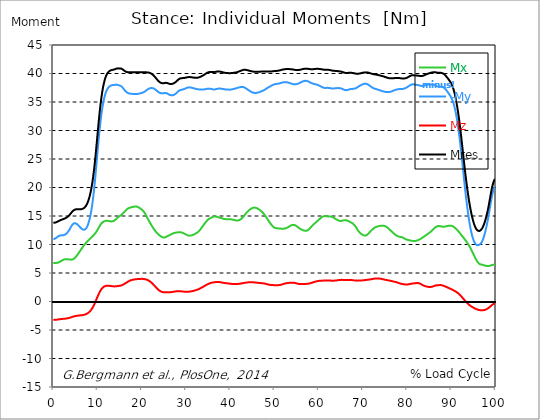
| Category |  Mx |  -My |  Mz |  Mres |
|---|---|---|---|---|
| 0.0 | 6.77 | 10.92 | -3.23 | 13.8 |
| 0.167348456675344 | 6.77 | 10.96 | -3.22 | 13.81 |
| 0.334696913350688 | 6.77 | 11.01 | -3.22 | 13.83 |
| 0.5020453700260321 | 6.77 | 11.09 | -3.21 | 13.87 |
| 0.669393826701376 | 6.77 | 11.18 | -3.2 | 13.91 |
| 0.83674228337672 | 6.78 | 11.29 | -3.18 | 13.97 |
| 1.0040907400520642 | 6.81 | 11.39 | -3.16 | 14.04 |
| 1.1621420602454444 | 6.85 | 11.47 | -3.14 | 14.11 |
| 1.3294905169207885 | 6.91 | 11.53 | -3.12 | 14.17 |
| 1.4968389735961325 | 6.98 | 11.57 | -3.11 | 14.23 |
| 1.6641874302714765 | 7.06 | 11.6 | -3.09 | 14.29 |
| 1.8315358869468206 | 7.14 | 11.61 | -3.07 | 14.34 |
| 1.9988843436221646 | 7.22 | 11.61 | -3.06 | 14.39 |
| 2.1662328002975086 | 7.29 | 11.62 | -3.05 | 14.44 |
| 2.333581256972853 | 7.35 | 11.64 | -3.03 | 14.48 |
| 2.5009297136481967 | 7.39 | 11.68 | -3.02 | 14.53 |
| 2.6682781703235405 | 7.41 | 11.74 | -3.01 | 14.59 |
| 2.8356266269988843 | 7.42 | 11.83 | -2.99 | 14.66 |
| 3.002975083674229 | 7.42 | 11.95 | -2.97 | 14.74 |
| 3.1703235403495724 | 7.41 | 12.09 | -2.95 | 14.83 |
| 3.337671997024917 | 7.4 | 12.26 | -2.93 | 14.94 |
| 3.4957233172182973 | 7.38 | 12.44 | -2.9 | 15.06 |
| 3.663071773893641 | 7.36 | 12.65 | -2.86 | 15.19 |
| 3.8304202305689854 | 7.35 | 12.87 | -2.82 | 15.34 |
| 3.997768687244329 | 7.34 | 13.11 | -2.78 | 15.51 |
| 4.165117143919673 | 7.35 | 13.33 | -2.73 | 15.68 |
| 4.332465600595017 | 7.38 | 13.51 | -2.68 | 15.83 |
| 4.499814057270361 | 7.43 | 13.64 | -2.64 | 15.95 |
| 4.667162513945706 | 7.52 | 13.72 | -2.61 | 16.04 |
| 4.834510970621049 | 7.62 | 13.74 | -2.57 | 16.11 |
| 5.001859427296393 | 7.75 | 13.72 | -2.55 | 16.16 |
| 5.169207883971737 | 7.9 | 13.66 | -2.52 | 16.18 |
| 5.336556340647081 | 8.07 | 13.58 | -2.5 | 16.2 |
| 5.503904797322425 | 8.24 | 13.47 | -2.48 | 16.2 |
| 5.671253253997769 | 8.43 | 13.34 | -2.47 | 16.2 |
| 5.82930457419115 | 8.63 | 13.21 | -2.46 | 16.19 |
| 5.996653030866494 | 8.83 | 13.07 | -2.44 | 16.18 |
| 6.164001487541838 | 9.02 | 12.93 | -2.43 | 16.18 |
| 6.331349944217181 | 9.22 | 12.81 | -2.41 | 16.2 |
| 6.498698400892526 | 9.4 | 12.7 | -2.4 | 16.22 |
| 6.66604685756787 | 9.59 | 12.63 | -2.38 | 16.27 |
| 6.833395314243213 | 9.77 | 12.59 | -2.35 | 16.34 |
| 7.000743770918558 | 9.94 | 12.59 | -2.32 | 16.44 |
| 7.168092227593902 | 10.1 | 12.64 | -2.29 | 16.57 |
| 7.335440684269246 | 10.25 | 12.76 | -2.24 | 16.74 |
| 7.50278914094459 | 10.39 | 12.94 | -2.18 | 16.96 |
| 7.6701375976199335 | 10.52 | 13.18 | -2.11 | 17.22 |
| 7.837486054295278 | 10.66 | 13.5 | -2.02 | 17.54 |
| 7.995537374488658 | 10.79 | 13.89 | -1.92 | 17.91 |
| 8.162885831164003 | 10.92 | 14.37 | -1.8 | 18.36 |
| 8.330234287839346 | 11.05 | 14.93 | -1.67 | 18.87 |
| 8.49758274451469 | 11.17 | 15.59 | -1.51 | 19.48 |
| 8.664931201190035 | 11.3 | 16.36 | -1.33 | 20.17 |
| 8.832279657865378 | 11.43 | 17.24 | -1.13 | 20.97 |
| 8.999628114540721 | 11.56 | 18.24 | -0.9 | 21.88 |
| 9.166976571216066 | 11.7 | 19.36 | -0.65 | 22.9 |
| 9.334325027891412 | 11.84 | 20.61 | -0.37 | 24.04 |
| 9.501673484566755 | 12 | 21.97 | -0.07 | 25.3 |
| 9.669021941242098 | 12.18 | 23.41 | 0.24 | 26.64 |
| 9.836370397917442 | 12.37 | 24.89 | 0.55 | 28.04 |
| 10.003718854592787 | 12.59 | 26.37 | 0.87 | 29.45 |
| 10.17106731126813 | 12.82 | 27.82 | 1.17 | 30.85 |
| 10.329118631461512 | 13.05 | 29.2 | 1.45 | 32.19 |
| 10.496467088136853 | 13.28 | 30.48 | 1.71 | 33.45 |
| 10.663815544812199 | 13.49 | 31.65 | 1.93 | 34.6 |
| 10.831164001487544 | 13.67 | 32.7 | 2.13 | 35.62 |
| 10.998512458162887 | 13.81 | 33.62 | 2.3 | 36.52 |
| 11.16586091483823 | 13.93 | 34.42 | 2.44 | 37.3 |
| 11.333209371513574 | 14.01 | 35.11 | 2.55 | 37.97 |
| 11.50055782818892 | 14.07 | 35.71 | 2.64 | 38.54 |
| 11.667906284864264 | 14.12 | 36.21 | 2.7 | 39.02 |
| 11.835254741539607 | 14.15 | 36.62 | 2.74 | 39.42 |
| 12.00260319821495 | 14.16 | 36.95 | 2.77 | 39.73 |
| 12.169951654890292 | 14.16 | 37.22 | 2.78 | 39.97 |
| 12.337300111565641 | 14.14 | 37.43 | 2.77 | 40.16 |
| 12.504648568240984 | 14.12 | 37.59 | 2.76 | 40.31 |
| 12.662699888434362 | 14.09 | 37.72 | 2.75 | 40.42 |
| 12.830048345109708 | 14.07 | 37.82 | 2.73 | 40.51 |
| 12.997396801785053 | 14.05 | 37.89 | 2.71 | 40.57 |
| 13.164745258460396 | 14.05 | 37.94 | 2.7 | 40.61 |
| 13.33209371513574 | 14.06 | 37.96 | 2.68 | 40.63 |
| 13.499442171811083 | 14.09 | 37.98 | 2.66 | 40.65 |
| 13.666790628486426 | 14.14 | 37.99 | 2.65 | 40.68 |
| 13.834139085161771 | 14.22 | 38.01 | 2.65 | 40.72 |
| 14.001487541837117 | 14.31 | 38.03 | 2.65 | 40.78 |
| 14.16883599851246 | 14.42 | 38.05 | 2.66 | 40.84 |
| 14.336184455187803 | 14.55 | 38.05 | 2.68 | 40.88 |
| 14.503532911863147 | 14.68 | 38.02 | 2.7 | 40.9 |
| 14.670881368538492 | 14.81 | 37.97 | 2.72 | 40.9 |
| 14.828932688731873 | 14.92 | 37.92 | 2.74 | 40.89 |
| 14.996281145407215 | 15.01 | 37.88 | 2.75 | 40.89 |
| 15.163629602082558 | 15.08 | 37.86 | 2.78 | 40.89 |
| 15.330978058757903 | 15.17 | 37.79 | 2.81 | 40.86 |
| 15.498326515433247 | 15.28 | 37.68 | 2.86 | 40.81 |
| 15.665674972108594 | 15.4 | 37.53 | 2.92 | 40.72 |
| 15.833023428783937 | 15.54 | 37.36 | 2.99 | 40.62 |
| 16.00037188545928 | 15.68 | 37.18 | 3.06 | 40.51 |
| 16.167720342134626 | 15.82 | 37.02 | 3.14 | 40.42 |
| 16.335068798809967 | 15.95 | 36.88 | 3.22 | 40.34 |
| 16.502417255485312 | 16.07 | 36.76 | 3.3 | 40.29 |
| 16.669765712160658 | 16.19 | 36.66 | 3.38 | 40.25 |
| 16.837114168836 | 16.3 | 36.58 | 3.46 | 40.22 |
| 17.004462625511344 | 16.38 | 36.53 | 3.53 | 40.21 |
| 17.16251394570472 | 16.43 | 36.49 | 3.6 | 40.2 |
| 17.32986240238007 | 16.48 | 36.46 | 3.66 | 40.2 |
| 17.497210859055414 | 16.51 | 36.44 | 3.72 | 40.2 |
| 17.664559315730756 | 16.53 | 36.43 | 3.77 | 40.21 |
| 17.8319077724061 | 16.56 | 36.43 | 3.8 | 40.21 |
| 17.999256229081443 | 16.6 | 36.42 | 3.83 | 40.22 |
| 18.166604685756788 | 16.63 | 36.4 | 3.85 | 40.23 |
| 18.333953142432133 | 16.66 | 36.39 | 3.87 | 40.23 |
| 18.501301599107478 | 16.67 | 36.39 | 3.89 | 40.23 |
| 18.668650055782823 | 16.67 | 36.39 | 3.9 | 40.23 |
| 18.835998512458165 | 16.65 | 36.4 | 3.92 | 40.24 |
| 19.00334696913351 | 16.61 | 36.41 | 3.93 | 40.24 |
| 19.170695425808855 | 16.56 | 36.44 | 3.94 | 40.24 |
| 19.338043882484197 | 16.49 | 36.46 | 3.95 | 40.24 |
| 19.496095202677576 | 16.41 | 36.49 | 3.96 | 40.24 |
| 19.66344365935292 | 16.32 | 36.52 | 3.97 | 40.23 |
| 19.830792116028263 | 16.22 | 36.55 | 3.97 | 40.22 |
| 19.998140572703612 | 16.11 | 36.59 | 3.97 | 40.21 |
| 20.165489029378953 | 16 | 36.64 | 3.97 | 40.21 |
| 20.3328374860543 | 15.87 | 36.69 | 3.96 | 40.21 |
| 20.500185942729644 | 15.71 | 36.75 | 3.94 | 40.21 |
| 20.667534399404985 | 15.52 | 36.83 | 3.92 | 40.2 |
| 20.83488285608033 | 15.3 | 36.92 | 3.89 | 40.2 |
| 21.002231312755672 | 15.05 | 37.03 | 3.86 | 40.2 |
| 21.16957976943102 | 14.79 | 37.13 | 3.81 | 40.2 |
| 21.336928226106362 | 14.54 | 37.22 | 3.76 | 40.19 |
| 21.504276682781704 | 14.3 | 37.3 | 3.69 | 40.17 |
| 21.67162513945705 | 14.07 | 37.37 | 3.62 | 40.14 |
| 21.82967645965043 | 13.84 | 37.41 | 3.53 | 40.1 |
| 21.997024916325774 | 13.62 | 37.44 | 3.43 | 40.04 |
| 22.16437337300112 | 13.4 | 37.46 | 3.32 | 39.97 |
| 22.33172182967646 | 13.18 | 37.45 | 3.2 | 39.88 |
| 22.499070286351806 | 12.98 | 37.42 | 3.07 | 39.77 |
| 22.666418743027148 | 12.78 | 37.38 | 2.94 | 39.65 |
| 22.833767199702496 | 12.6 | 37.31 | 2.79 | 39.52 |
| 23.00111565637784 | 12.42 | 37.23 | 2.65 | 39.38 |
| 23.168464113053183 | 12.25 | 37.13 | 2.51 | 39.22 |
| 23.335812569728528 | 12.1 | 37.01 | 2.37 | 39.05 |
| 23.50316102640387 | 11.96 | 36.9 | 2.24 | 38.89 |
| 23.670509483079215 | 11.83 | 36.8 | 2.11 | 38.74 |
| 23.83785793975456 | 11.72 | 36.71 | 2 | 38.62 |
| 23.995909259947936 | 11.61 | 36.63 | 1.9 | 38.51 |
| 24.163257716623285 | 11.51 | 36.57 | 1.82 | 38.42 |
| 24.330606173298627 | 11.42 | 36.54 | 1.75 | 38.35 |
| 24.49795462997397 | 11.34 | 36.52 | 1.7 | 38.31 |
| 24.665303086649313 | 11.27 | 36.52 | 1.66 | 38.29 |
| 24.83265154332466 | 11.23 | 36.53 | 1.62 | 38.29 |
| 25.0 | 11.21 | 36.55 | 1.61 | 38.3 |
| 25.167348456675345 | 11.23 | 36.57 | 1.6 | 38.33 |
| 25.334696913350694 | 11.28 | 36.59 | 1.61 | 38.36 |
| 25.502045370026035 | 11.34 | 36.57 | 1.62 | 38.37 |
| 25.669393826701377 | 11.41 | 36.53 | 1.63 | 38.35 |
| 25.836742283376722 | 11.47 | 36.46 | 1.62 | 38.3 |
| 26.004090740052067 | 11.54 | 36.37 | 1.62 | 38.25 |
| 26.17143919672741 | 11.62 | 36.3 | 1.62 | 38.2 |
| 26.329490516920792 | 11.68 | 36.24 | 1.62 | 38.17 |
| 26.49683897359613 | 11.74 | 36.21 | 1.63 | 38.16 |
| 26.66418743027148 | 11.8 | 36.19 | 1.65 | 38.16 |
| 26.831535886946828 | 11.87 | 36.18 | 1.67 | 38.18 |
| 26.998884343622166 | 11.93 | 36.19 | 1.69 | 38.21 |
| 27.166232800297514 | 11.98 | 36.22 | 1.71 | 38.25 |
| 27.333581256972852 | 12.02 | 36.27 | 1.74 | 38.32 |
| 27.5009297136482 | 12.06 | 36.35 | 1.76 | 38.4 |
| 27.668278170323543 | 12.08 | 36.46 | 1.78 | 38.52 |
| 27.835626626998888 | 12.1 | 36.58 | 1.79 | 38.63 |
| 28.002975083674233 | 12.12 | 36.7 | 1.8 | 38.75 |
| 28.170323540349575 | 12.13 | 36.82 | 1.81 | 38.87 |
| 28.33767199702492 | 12.14 | 36.94 | 1.81 | 38.99 |
| 28.50502045370026 | 12.14 | 37.03 | 1.81 | 39.08 |
| 28.663071773893645 | 12.14 | 37.09 | 1.8 | 39.13 |
| 28.830420230568986 | 12.14 | 37.13 | 1.79 | 39.17 |
| 28.99776868724433 | 12.12 | 37.16 | 1.77 | 39.18 |
| 29.165117143919673 | 12.08 | 37.18 | 1.76 | 39.19 |
| 29.33246560059502 | 12.02 | 37.21 | 1.74 | 39.2 |
| 29.499814057270367 | 11.96 | 37.25 | 1.73 | 39.21 |
| 29.66716251394571 | 11.89 | 37.3 | 1.72 | 39.23 |
| 29.834510970621054 | 11.81 | 37.36 | 1.71 | 39.26 |
| 30.00185942729639 | 11.74 | 37.42 | 1.7 | 39.29 |
| 30.169207883971744 | 11.67 | 37.48 | 1.71 | 39.33 |
| 30.33655634064708 | 11.61 | 37.53 | 1.71 | 39.35 |
| 30.50390479732243 | 11.57 | 37.56 | 1.72 | 39.37 |
| 30.671253253997772 | 11.55 | 37.57 | 1.73 | 39.38 |
| 30.829304574191156 | 11.56 | 37.56 | 1.74 | 39.37 |
| 30.996653030866494 | 11.57 | 37.55 | 1.76 | 39.36 |
| 31.164001487541842 | 11.59 | 37.52 | 1.78 | 39.34 |
| 31.331349944217187 | 11.62 | 37.49 | 1.81 | 39.32 |
| 31.498698400892525 | 11.67 | 37.46 | 1.83 | 39.31 |
| 31.666046857567874 | 11.72 | 37.42 | 1.87 | 39.29 |
| 31.833395314243212 | 11.77 | 37.38 | 1.9 | 39.27 |
| 32.00074377091856 | 11.84 | 37.35 | 1.94 | 39.26 |
| 32.1680922275939 | 11.91 | 37.31 | 1.98 | 39.25 |
| 32.33544068426925 | 11.99 | 37.28 | 2.02 | 39.25 |
| 32.50278914094459 | 12.07 | 37.25 | 2.07 | 39.26 |
| 32.670137597619934 | 12.16 | 37.23 | 2.11 | 39.27 |
| 32.83748605429528 | 12.28 | 37.22 | 2.16 | 39.3 |
| 33.004834510970625 | 12.41 | 37.21 | 2.22 | 39.34 |
| 33.162885831164004 | 12.57 | 37.2 | 2.28 | 39.4 |
| 33.33023428783935 | 12.74 | 37.2 | 2.35 | 39.46 |
| 33.497582744514695 | 12.92 | 37.19 | 2.43 | 39.52 |
| 33.664931201190036 | 13.1 | 37.19 | 2.5 | 39.58 |
| 33.83227965786538 | 13.28 | 37.19 | 2.57 | 39.65 |
| 33.99962811454073 | 13.46 | 37.2 | 2.65 | 39.73 |
| 34.16697657121607 | 13.64 | 37.21 | 2.72 | 39.81 |
| 34.33432502789141 | 13.81 | 37.24 | 2.8 | 39.9 |
| 34.50167348456676 | 13.98 | 37.28 | 2.87 | 40 |
| 34.6690219412421 | 14.13 | 37.31 | 2.95 | 40.08 |
| 34.83637039791744 | 14.26 | 37.33 | 3.01 | 40.15 |
| 35.00371885459279 | 14.37 | 37.34 | 3.08 | 40.2 |
| 35.17106731126814 | 14.47 | 37.35 | 3.13 | 40.24 |
| 35.338415767943474 | 14.55 | 37.34 | 3.18 | 40.26 |
| 35.49646708813686 | 14.62 | 37.33 | 3.23 | 40.27 |
| 35.6638155448122 | 14.69 | 37.3 | 3.27 | 40.28 |
| 35.831164001487544 | 14.77 | 37.26 | 3.3 | 40.27 |
| 35.998512458162885 | 14.84 | 37.22 | 3.32 | 40.26 |
| 36.165860914838234 | 14.89 | 37.2 | 3.35 | 40.26 |
| 36.333209371513576 | 14.92 | 37.19 | 3.37 | 40.26 |
| 36.50055782818892 | 14.92 | 37.2 | 3.39 | 40.27 |
| 36.667906284864266 | 14.91 | 37.23 | 3.4 | 40.29 |
| 36.83525474153961 | 14.88 | 37.26 | 3.41 | 40.31 |
| 37.002603198214956 | 14.85 | 37.3 | 3.42 | 40.34 |
| 37.1699516548903 | 14.81 | 37.33 | 3.42 | 40.35 |
| 37.337300111565646 | 14.77 | 37.35 | 3.42 | 40.36 |
| 37.50464856824098 | 14.73 | 37.36 | 3.41 | 40.35 |
| 37.66269988843437 | 14.7 | 37.36 | 3.39 | 40.34 |
| 37.83004834510971 | 14.66 | 37.34 | 3.37 | 40.31 |
| 37.99739680178505 | 14.61 | 37.33 | 3.35 | 40.28 |
| 38.16474525846039 | 14.58 | 37.3 | 3.32 | 40.24 |
| 38.33209371513574 | 14.54 | 37.28 | 3.3 | 40.21 |
| 38.49944217181109 | 14.5 | 37.26 | 3.27 | 40.17 |
| 38.666790628486424 | 14.48 | 37.24 | 3.25 | 40.14 |
| 38.83413908516178 | 14.46 | 37.22 | 3.23 | 40.12 |
| 39.001487541837115 | 14.45 | 37.2 | 3.21 | 40.1 |
| 39.16883599851246 | 14.44 | 37.19 | 3.2 | 40.09 |
| 39.336184455187805 | 14.44 | 37.18 | 3.19 | 40.08 |
| 39.503532911863154 | 14.44 | 37.17 | 3.17 | 40.07 |
| 39.670881368538495 | 14.44 | 37.17 | 3.15 | 40.06 |
| 39.83822982521384 | 14.44 | 37.17 | 3.14 | 40.06 |
| 39.996281145407224 | 14.43 | 37.17 | 3.12 | 40.06 |
| 40.163629602082565 | 14.42 | 37.19 | 3.1 | 40.07 |
| 40.33097805875791 | 14.4 | 37.21 | 3.09 | 40.08 |
| 40.498326515433256 | 14.37 | 37.24 | 3.08 | 40.1 |
| 40.6656749721086 | 14.34 | 37.27 | 3.07 | 40.11 |
| 40.83302342878393 | 14.3 | 37.3 | 3.07 | 40.13 |
| 41.00037188545929 | 14.27 | 37.33 | 3.06 | 40.15 |
| 41.16772034213463 | 14.24 | 37.36 | 3.06 | 40.17 |
| 41.33506879880997 | 14.22 | 37.4 | 3.07 | 40.19 |
| 41.50241725548531 | 14.21 | 37.44 | 3.07 | 40.23 |
| 41.66976571216066 | 14.21 | 37.49 | 3.08 | 40.27 |
| 41.837114168836 | 14.23 | 37.53 | 3.09 | 40.31 |
| 42.004462625511344 | 14.27 | 37.56 | 3.1 | 40.36 |
| 42.17181108218669 | 14.33 | 37.6 | 3.12 | 40.41 |
| 42.32986240238007 | 14.41 | 37.62 | 3.14 | 40.47 |
| 42.497210859055414 | 14.51 | 37.64 | 3.16 | 40.52 |
| 42.66455931573076 | 14.63 | 37.65 | 3.18 | 40.57 |
| 42.831907772406105 | 14.77 | 37.64 | 3.21 | 40.61 |
| 42.999256229081446 | 14.92 | 37.61 | 3.23 | 40.64 |
| 43.16660468575679 | 15.09 | 37.56 | 3.26 | 40.66 |
| 43.33395314243214 | 15.26 | 37.49 | 3.28 | 40.66 |
| 43.50130159910748 | 15.42 | 37.41 | 3.31 | 40.65 |
| 43.66865005578282 | 15.57 | 37.33 | 3.33 | 40.62 |
| 43.83599851245817 | 15.71 | 37.23 | 3.34 | 40.59 |
| 44.00334696913351 | 15.84 | 37.14 | 3.35 | 40.56 |
| 44.17069542580886 | 15.96 | 37.05 | 3.37 | 40.52 |
| 44.3380438824842 | 16.07 | 36.97 | 3.37 | 40.48 |
| 44.49609520267758 | 16.17 | 36.88 | 3.38 | 40.44 |
| 44.66344365935292 | 16.26 | 36.81 | 3.38 | 40.41 |
| 44.83079211602827 | 16.34 | 36.74 | 3.38 | 40.38 |
| 44.99814057270361 | 16.41 | 36.68 | 3.38 | 40.36 |
| 45.16548902937895 | 16.46 | 36.64 | 3.37 | 40.34 |
| 45.332837486054295 | 16.48 | 36.61 | 3.36 | 40.32 |
| 45.500185942729644 | 16.48 | 36.6 | 3.35 | 40.31 |
| 45.66753439940499 | 16.46 | 36.59 | 3.34 | 40.3 |
| 45.83488285608033 | 16.42 | 36.6 | 3.32 | 40.29 |
| 46.00223131275568 | 16.37 | 36.61 | 3.31 | 40.29 |
| 46.16957976943102 | 16.31 | 36.64 | 3.29 | 40.29 |
| 46.336928226106366 | 16.23 | 36.67 | 3.28 | 40.29 |
| 46.50427668278171 | 16.15 | 36.71 | 3.26 | 40.3 |
| 46.671625139457056 | 16.05 | 36.76 | 3.25 | 40.31 |
| 46.829676459650436 | 15.95 | 36.81 | 3.23 | 40.33 |
| 46.99702491632577 | 15.85 | 36.86 | 3.22 | 40.34 |
| 47.16437337300112 | 15.74 | 36.91 | 3.21 | 40.34 |
| 47.33172182967646 | 15.61 | 36.96 | 3.19 | 40.35 |
| 47.49907028635181 | 15.47 | 37.03 | 3.18 | 40.36 |
| 47.66641874302716 | 15.31 | 37.1 | 3.16 | 40.36 |
| 47.83376719970249 | 15.13 | 37.17 | 3.14 | 40.36 |
| 48.001115656377834 | 14.93 | 37.26 | 3.1 | 40.36 |
| 48.16846411305319 | 14.73 | 37.35 | 3.06 | 40.37 |
| 48.33581256972853 | 14.53 | 37.44 | 3.03 | 40.37 |
| 48.50316102640387 | 14.34 | 37.52 | 3 | 40.37 |
| 48.67050948307921 | 14.14 | 37.59 | 2.97 | 40.36 |
| 48.837857939754564 | 13.96 | 37.66 | 2.94 | 40.36 |
| 49.005206396429905 | 13.78 | 37.73 | 2.92 | 40.36 |
| 49.163257716623285 | 13.6 | 37.8 | 2.9 | 40.36 |
| 49.33060617329863 | 13.43 | 37.87 | 2.89 | 40.37 |
| 49.49795462997397 | 13.28 | 37.94 | 2.88 | 40.38 |
| 49.66530308664932 | 13.15 | 38 | 2.88 | 40.39 |
| 49.832651543324666 | 13.03 | 38.06 | 2.87 | 40.41 |
| 50.0 | 12.95 | 38.11 | 2.86 | 40.43 |
| 50.16734845667534 | 12.89 | 38.15 | 2.86 | 40.44 |
| 50.33469691335069 | 12.86 | 38.17 | 2.85 | 40.45 |
| 50.50204537002604 | 12.84 | 38.18 | 2.85 | 40.46 |
| 50.66939382670139 | 12.84 | 38.19 | 2.85 | 40.47 |
| 50.836742283376715 | 12.83 | 38.21 | 2.86 | 40.48 |
| 51.00409074005207 | 12.83 | 38.23 | 2.87 | 40.51 |
| 51.17143919672741 | 12.81 | 38.27 | 2.89 | 40.54 |
| 51.32949051692079 | 12.8 | 38.32 | 2.92 | 40.58 |
| 51.496838973596134 | 12.78 | 38.36 | 2.95 | 40.62 |
| 51.66418743027148 | 12.76 | 38.4 | 2.99 | 40.66 |
| 51.831535886946824 | 12.75 | 38.44 | 3.03 | 40.69 |
| 51.99888434362217 | 12.75 | 38.46 | 3.07 | 40.71 |
| 52.16623280029752 | 12.77 | 38.47 | 3.11 | 40.73 |
| 52.33358125697285 | 12.8 | 38.48 | 3.14 | 40.75 |
| 52.5009297136482 | 12.84 | 38.48 | 3.18 | 40.76 |
| 52.668278170323546 | 12.88 | 38.48 | 3.2 | 40.78 |
| 52.835626626998895 | 12.94 | 38.46 | 3.22 | 40.79 |
| 53.00297508367424 | 13.01 | 38.43 | 3.24 | 40.79 |
| 53.17032354034958 | 13.08 | 38.39 | 3.26 | 40.78 |
| 53.33767199702492 | 13.16 | 38.35 | 3.27 | 40.77 |
| 53.50502045370027 | 13.24 | 38.3 | 3.29 | 40.76 |
| 53.663071773893655 | 13.32 | 38.26 | 3.3 | 40.75 |
| 53.83042023056899 | 13.39 | 38.22 | 3.31 | 40.74 |
| 53.99776868724433 | 13.43 | 38.18 | 3.31 | 40.73 |
| 54.16511714391967 | 13.45 | 38.16 | 3.3 | 40.71 |
| 54.33246560059503 | 13.45 | 38.13 | 3.29 | 40.68 |
| 54.49981405727037 | 13.42 | 38.12 | 3.27 | 40.66 |
| 54.667162513945705 | 13.37 | 38.11 | 3.25 | 40.63 |
| 54.834510970621054 | 13.3 | 38.12 | 3.22 | 40.61 |
| 55.0018594272964 | 13.21 | 38.14 | 3.18 | 40.59 |
| 55.169207883971744 | 13.11 | 38.17 | 3.14 | 40.59 |
| 55.336556340647086 | 13.01 | 38.22 | 3.11 | 40.6 |
| 55.50390479732243 | 12.92 | 38.27 | 3.08 | 40.61 |
| 55.671253253997776 | 12.83 | 38.33 | 3.06 | 40.64 |
| 55.83860171067312 | 12.75 | 38.39 | 3.05 | 40.67 |
| 55.9966530308665 | 12.68 | 38.46 | 3.05 | 40.7 |
| 56.16400148754184 | 12.6 | 38.53 | 3.05 | 40.74 |
| 56.33134994421718 | 12.54 | 38.59 | 3.06 | 40.77 |
| 56.498698400892536 | 12.49 | 38.64 | 3.06 | 40.81 |
| 56.66604685756788 | 12.44 | 38.68 | 3.07 | 40.83 |
| 56.83339531424321 | 12.41 | 38.71 | 3.08 | 40.84 |
| 57.00074377091856 | 12.4 | 38.72 | 3.08 | 40.85 |
| 57.16809222759391 | 12.4 | 38.71 | 3.09 | 40.85 |
| 57.33544068426925 | 12.43 | 38.69 | 3.1 | 40.85 |
| 57.5027891409446 | 12.5 | 38.66 | 3.11 | 40.83 |
| 57.670137597619934 | 12.59 | 38.6 | 3.13 | 40.81 |
| 57.83748605429528 | 12.7 | 38.53 | 3.15 | 40.79 |
| 58.004834510970625 | 12.84 | 38.46 | 3.18 | 40.77 |
| 58.16288583116401 | 12.98 | 38.39 | 3.22 | 40.76 |
| 58.330234287839346 | 13.12 | 38.33 | 3.26 | 40.75 |
| 58.497582744514695 | 13.27 | 38.27 | 3.3 | 40.75 |
| 58.66493120119004 | 13.4 | 38.22 | 3.35 | 40.75 |
| 58.832279657865385 | 13.53 | 38.18 | 3.39 | 40.76 |
| 58.999628114540734 | 13.64 | 38.16 | 3.44 | 40.78 |
| 59.16697657121607 | 13.75 | 38.13 | 3.47 | 40.8 |
| 59.33432502789142 | 13.87 | 38.1 | 3.51 | 40.81 |
| 59.50167348456676 | 13.98 | 38.07 | 3.54 | 40.82 |
| 59.66902194124211 | 14.1 | 38.02 | 3.57 | 40.82 |
| 59.83637039791745 | 14.21 | 37.97 | 3.59 | 40.82 |
| 60.00371885459278 | 14.33 | 37.91 | 3.61 | 40.81 |
| 60.17106731126813 | 14.45 | 37.85 | 3.63 | 40.8 |
| 60.33841576794349 | 14.57 | 37.78 | 3.64 | 40.78 |
| 60.49646708813685 | 14.68 | 37.71 | 3.65 | 40.76 |
| 60.6638155448122 | 14.78 | 37.65 | 3.66 | 40.74 |
| 60.831164001487544 | 14.86 | 37.58 | 3.66 | 40.71 |
| 60.99851245816289 | 14.93 | 37.53 | 3.67 | 40.69 |
| 61.16586091483824 | 14.97 | 37.49 | 3.67 | 40.67 |
| 61.333209371513576 | 15 | 37.47 | 3.68 | 40.66 |
| 61.50055782818892 | 14.99 | 37.46 | 3.68 | 40.66 |
| 61.667906284864266 | 14.97 | 37.47 | 3.69 | 40.66 |
| 61.835254741539615 | 14.95 | 37.48 | 3.7 | 40.66 |
| 62.002603198214956 | 14.93 | 37.49 | 3.7 | 40.66 |
| 62.16995165489029 | 14.92 | 37.48 | 3.69 | 40.65 |
| 62.33730011156564 | 14.92 | 37.46 | 3.69 | 40.63 |
| 62.504648568240995 | 14.91 | 37.44 | 3.68 | 40.61 |
| 62.67199702491633 | 14.9 | 37.42 | 3.67 | 40.58 |
| 62.83004834510971 | 14.88 | 37.4 | 3.66 | 40.55 |
| 62.99739680178505 | 14.84 | 37.38 | 3.65 | 40.52 |
| 63.1647452584604 | 14.79 | 37.37 | 3.65 | 40.49 |
| 63.33209371513575 | 14.72 | 37.37 | 3.65 | 40.47 |
| 63.4994421718111 | 14.64 | 37.38 | 3.66 | 40.46 |
| 63.666790628486424 | 14.56 | 37.4 | 3.67 | 40.46 |
| 63.83413908516177 | 14.47 | 37.42 | 3.68 | 40.45 |
| 64.00148754183712 | 14.4 | 37.43 | 3.69 | 40.44 |
| 64.16883599851248 | 14.32 | 37.43 | 3.71 | 40.42 |
| 64.3361844551878 | 14.26 | 37.44 | 3.73 | 40.41 |
| 64.50353291186315 | 14.2 | 37.43 | 3.75 | 40.39 |
| 64.6708813685385 | 14.16 | 37.43 | 3.77 | 40.38 |
| 64.83822982521384 | 14.13 | 37.42 | 3.78 | 40.36 |
| 65.00557828188919 | 14.13 | 37.39 | 3.79 | 40.34 |
| 65.16362960208257 | 14.15 | 37.35 | 3.8 | 40.31 |
| 65.3309780587579 | 14.18 | 37.3 | 3.8 | 40.27 |
| 65.49832651543326 | 14.22 | 37.24 | 3.79 | 40.23 |
| 65.6656749721086 | 14.25 | 37.18 | 3.78 | 40.18 |
| 65.83302342878395 | 14.26 | 37.13 | 3.78 | 40.14 |
| 66.00037188545929 | 14.27 | 37.09 | 3.77 | 40.11 |
| 66.16772034213463 | 14.26 | 37.07 | 3.77 | 40.09 |
| 66.33506879880998 | 14.23 | 37.08 | 3.78 | 40.08 |
| 66.50241725548531 | 14.18 | 37.11 | 3.78 | 40.09 |
| 66.66976571216065 | 14.12 | 37.15 | 3.79 | 40.11 |
| 66.83711416883601 | 14.06 | 37.19 | 3.79 | 40.12 |
| 67.00446262551135 | 13.99 | 37.23 | 3.79 | 40.13 |
| 67.1718110821867 | 13.93 | 37.26 | 3.78 | 40.13 |
| 67.32986240238007 | 13.86 | 37.28 | 3.77 | 40.13 |
| 67.49721085905541 | 13.78 | 37.29 | 3.76 | 40.11 |
| 67.66455931573076 | 13.69 | 37.3 | 3.74 | 40.09 |
| 67.83190777240611 | 13.59 | 37.32 | 3.72 | 40.07 |
| 67.99925622908145 | 13.47 | 37.33 | 3.71 | 40.04 |
| 68.16660468575678 | 13.33 | 37.36 | 3.69 | 40.01 |
| 68.33395314243214 | 13.16 | 37.4 | 3.68 | 39.98 |
| 68.50130159910749 | 12.95 | 37.46 | 3.67 | 39.96 |
| 68.66865005578282 | 12.73 | 37.54 | 3.66 | 39.95 |
| 68.83599851245816 | 12.51 | 37.63 | 3.66 | 39.95 |
| 69.00334696913352 | 12.33 | 37.71 | 3.66 | 39.97 |
| 69.17069542580886 | 12.17 | 37.79 | 3.67 | 39.99 |
| 69.3380438824842 | 12.04 | 37.87 | 3.67 | 40.01 |
| 69.50539233915956 | 11.92 | 37.94 | 3.68 | 40.04 |
| 69.66344365935292 | 11.82 | 38.01 | 3.69 | 40.08 |
| 69.83079211602826 | 11.73 | 38.07 | 3.7 | 40.11 |
| 69.99814057270362 | 11.66 | 38.13 | 3.72 | 40.14 |
| 70.16548902937896 | 11.6 | 38.17 | 3.73 | 40.17 |
| 70.33283748605429 | 11.56 | 38.2 | 3.75 | 40.18 |
| 70.50018594272964 | 11.55 | 38.21 | 3.76 | 40.19 |
| 70.667534399405 | 11.58 | 38.2 | 3.78 | 40.2 |
| 70.83488285608033 | 11.64 | 38.18 | 3.79 | 40.19 |
| 71.00223131275568 | 11.73 | 38.13 | 3.81 | 40.18 |
| 71.16957976943102 | 11.84 | 38.06 | 3.82 | 40.15 |
| 71.33692822610637 | 11.99 | 37.97 | 3.84 | 40.12 |
| 71.50427668278171 | 12.14 | 37.87 | 3.86 | 40.08 |
| 71.67162513945706 | 12.29 | 37.77 | 3.88 | 40.04 |
| 71.8389735961324 | 12.43 | 37.68 | 3.9 | 40 |
| 71.99702491632577 | 12.55 | 37.59 | 3.92 | 39.96 |
| 72.16437337300113 | 12.68 | 37.51 | 3.95 | 39.92 |
| 72.33172182967647 | 12.78 | 37.44 | 3.97 | 39.89 |
| 72.49907028635181 | 12.88 | 37.38 | 4 | 39.86 |
| 72.66641874302715 | 12.96 | 37.33 | 4.02 | 39.84 |
| 72.8337671997025 | 13.02 | 37.29 | 4.04 | 39.83 |
| 73.00111565637783 | 13.08 | 37.26 | 4.05 | 39.81 |
| 73.16846411305319 | 13.13 | 37.22 | 4.05 | 39.78 |
| 73.33581256972853 | 13.17 | 37.18 | 4.05 | 39.76 |
| 73.50316102640387 | 13.2 | 37.13 | 4.04 | 39.73 |
| 73.67050948307921 | 13.23 | 37.09 | 4.03 | 39.69 |
| 73.83785793975457 | 13.26 | 37.04 | 4.01 | 39.66 |
| 74.00520639642991 | 13.28 | 37 | 3.99 | 39.62 |
| 74.16325771662328 | 13.3 | 36.96 | 3.97 | 39.58 |
| 74.33060617329863 | 13.31 | 36.92 | 3.94 | 39.55 |
| 74.49795462997398 | 13.31 | 36.89 | 3.91 | 39.52 |
| 74.66530308664932 | 13.3 | 36.85 | 3.88 | 39.48 |
| 74.83265154332466 | 13.27 | 36.82 | 3.85 | 39.44 |
| 75.00000000000001 | 13.22 | 36.79 | 3.82 | 39.39 |
| 75.16734845667534 | 13.16 | 36.77 | 3.79 | 39.35 |
| 75.3346969133507 | 13.08 | 36.75 | 3.76 | 39.3 |
| 75.50204537002605 | 12.99 | 36.74 | 3.74 | 39.26 |
| 75.66939382670138 | 12.88 | 36.73 | 3.71 | 39.22 |
| 75.83674228337672 | 12.76 | 36.74 | 3.69 | 39.19 |
| 76.00409074005208 | 12.65 | 36.76 | 3.67 | 39.17 |
| 76.17143919672742 | 12.53 | 36.79 | 3.64 | 39.15 |
| 76.33878765340276 | 12.4 | 36.82 | 3.61 | 39.15 |
| 76.49683897359614 | 12.28 | 36.86 | 3.58 | 39.14 |
| 76.66418743027148 | 12.16 | 36.92 | 3.55 | 39.15 |
| 76.83153588694682 | 12.04 | 36.97 | 3.52 | 39.16 |
| 76.99888434362218 | 11.92 | 37.03 | 3.49 | 39.18 |
| 77.16623280029752 | 11.81 | 37.09 | 3.46 | 39.19 |
| 77.33358125697285 | 11.71 | 37.13 | 3.43 | 39.2 |
| 77.5009297136482 | 11.61 | 37.17 | 3.4 | 39.21 |
| 77.66827817032356 | 11.53 | 37.2 | 3.37 | 39.21 |
| 77.83562662699889 | 11.47 | 37.23 | 3.32 | 39.21 |
| 78.00297508367423 | 11.41 | 37.25 | 3.28 | 39.21 |
| 78.17032354034959 | 11.37 | 37.26 | 3.23 | 39.2 |
| 78.33767199702493 | 11.34 | 37.27 | 3.18 | 39.19 |
| 78.50502045370027 | 11.33 | 37.27 | 3.14 | 39.17 |
| 78.67236891037561 | 11.31 | 37.26 | 3.1 | 39.15 |
| 78.83042023056899 | 11.27 | 37.26 | 3.07 | 39.13 |
| 78.99776868724433 | 11.22 | 37.28 | 3.05 | 39.12 |
| 79.16511714391969 | 11.15 | 37.31 | 3.03 | 39.12 |
| 79.33246560059503 | 11.08 | 37.35 | 3.01 | 39.13 |
| 79.49981405727036 | 11 | 37.4 | 3 | 39.14 |
| 79.66716251394571 | 10.93 | 37.46 | 2.99 | 39.17 |
| 79.83451097062107 | 10.88 | 37.52 | 2.99 | 39.21 |
| 80.00185942729641 | 10.84 | 37.6 | 2.99 | 39.27 |
| 80.16920788397174 | 10.8 | 37.68 | 3 | 39.34 |
| 80.33655634064709 | 10.77 | 37.77 | 3.02 | 39.42 |
| 80.50390479732243 | 10.74 | 37.86 | 3.05 | 39.5 |
| 80.67125325399778 | 10.71 | 37.95 | 3.07 | 39.57 |
| 80.83860171067312 | 10.69 | 38.03 | 3.1 | 39.64 |
| 80.99665303086651 | 10.66 | 38.08 | 3.13 | 39.68 |
| 81.16400148754184 | 10.64 | 38.11 | 3.15 | 39.71 |
| 81.3313499442172 | 10.62 | 38.11 | 3.17 | 39.71 |
| 81.49869840089255 | 10.61 | 38.09 | 3.18 | 39.68 |
| 81.66604685756786 | 10.61 | 38.06 | 3.2 | 39.66 |
| 81.83339531424322 | 10.63 | 38.04 | 3.21 | 39.64 |
| 82.00074377091858 | 10.65 | 38.02 | 3.22 | 39.63 |
| 82.16809222759392 | 10.69 | 38.01 | 3.23 | 39.63 |
| 82.33544068426926 | 10.73 | 37.99 | 3.24 | 39.63 |
| 82.50278914094459 | 10.78 | 37.97 | 3.23 | 39.62 |
| 82.67013759761994 | 10.84 | 37.93 | 3.2 | 39.6 |
| 82.83748605429528 | 10.9 | 37.89 | 3.16 | 39.57 |
| 83.00483451097062 | 10.97 | 37.85 | 3.1 | 39.55 |
| 83.17218296764597 | 11.05 | 37.82 | 3.03 | 39.54 |
| 83.33023428783935 | 11.14 | 37.81 | 2.95 | 39.54 |
| 83.4975827445147 | 11.23 | 37.82 | 2.87 | 39.58 |
| 83.66493120119004 | 11.32 | 37.85 | 2.8 | 39.63 |
| 83.83227965786537 | 11.41 | 37.89 | 2.75 | 39.69 |
| 83.99962811454073 | 11.49 | 37.92 | 2.7 | 39.74 |
| 84.16697657121607 | 11.58 | 37.95 | 2.67 | 39.8 |
| 84.33432502789142 | 11.68 | 37.99 | 2.64 | 39.85 |
| 84.50167348456677 | 11.77 | 38.01 | 2.61 | 39.91 |
| 84.6690219412421 | 11.87 | 38.04 | 2.58 | 39.96 |
| 84.83637039791745 | 11.96 | 38.06 | 2.56 | 40.01 |
| 85.0037188545928 | 12.05 | 38.07 | 2.55 | 40.05 |
| 85.17106731126813 | 12.14 | 38.09 | 2.55 | 40.09 |
| 85.33841576794349 | 12.24 | 38.09 | 2.55 | 40.13 |
| 85.50576422461883 | 12.35 | 38.09 | 2.57 | 40.16 |
| 85.66381554481221 | 12.48 | 38.08 | 2.6 | 40.19 |
| 85.83116400148755 | 12.61 | 38.06 | 2.64 | 40.22 |
| 85.99851245816289 | 12.76 | 38.01 | 2.7 | 40.23 |
| 86.16586091483823 | 12.89 | 37.95 | 2.76 | 40.23 |
| 86.33320937151358 | 13 | 37.89 | 2.8 | 40.22 |
| 86.50055782818893 | 13.09 | 37.83 | 2.82 | 40.2 |
| 86.66790628486427 | 13.16 | 37.78 | 2.84 | 40.17 |
| 86.83525474153961 | 13.21 | 37.73 | 2.85 | 40.15 |
| 87.00260319821496 | 13.24 | 37.7 | 2.86 | 40.13 |
| 87.16995165489031 | 13.24 | 37.69 | 2.87 | 40.12 |
| 87.33730011156564 | 13.22 | 37.68 | 2.88 | 40.12 |
| 87.504648568241 | 13.2 | 37.69 | 2.88 | 40.11 |
| 87.67199702491634 | 13.18 | 37.69 | 2.87 | 40.11 |
| 87.83004834510972 | 13.15 | 37.69 | 2.86 | 40.09 |
| 87.99739680178506 | 13.13 | 37.66 | 2.83 | 40.05 |
| 88.1647452584604 | 13.12 | 37.61 | 2.78 | 39.99 |
| 88.33209371513574 | 13.12 | 37.52 | 2.73 | 39.9 |
| 88.49944217181108 | 13.14 | 37.4 | 2.67 | 39.79 |
| 88.66679062848644 | 13.17 | 37.26 | 2.61 | 39.65 |
| 88.83413908516178 | 13.2 | 37.1 | 2.56 | 39.5 |
| 89.00148754183712 | 13.23 | 36.93 | 2.5 | 39.34 |
| 89.16883599851246 | 13.25 | 36.75 | 2.44 | 39.18 |
| 89.33618445518782 | 13.28 | 36.56 | 2.38 | 39 |
| 89.50353291186315 | 13.3 | 36.37 | 2.33 | 38.83 |
| 89.6708813685385 | 13.31 | 36.18 | 2.27 | 38.64 |
| 89.83822982521386 | 13.31 | 35.97 | 2.21 | 38.44 |
| 90.00557828188919 | 13.29 | 35.72 | 2.16 | 38.2 |
| 90.16362960208257 | 13.25 | 35.44 | 2.09 | 37.92 |
| 90.3309780587579 | 13.19 | 35.1 | 2.02 | 37.58 |
| 90.49832651543326 | 13.12 | 34.71 | 1.95 | 37.18 |
| 90.66567497210859 | 13.02 | 34.24 | 1.88 | 36.71 |
| 90.83302342878395 | 12.9 | 33.69 | 1.81 | 36.16 |
| 91.00037188545929 | 12.79 | 33.06 | 1.73 | 35.54 |
| 91.16772034213463 | 12.66 | 32.36 | 1.65 | 34.85 |
| 91.33506879880998 | 12.53 | 31.58 | 1.56 | 34.08 |
| 91.50241725548533 | 12.39 | 30.73 | 1.46 | 33.25 |
| 91.66976571216065 | 12.23 | 29.8 | 1.35 | 32.34 |
| 91.83711416883601 | 12.07 | 28.8 | 1.23 | 31.37 |
| 92.00446262551137 | 11.91 | 27.73 | 1.11 | 30.33 |
| 92.1718110821867 | 11.74 | 26.59 | 0.97 | 29.23 |
| 92.33915953886203 | 11.57 | 25.4 | 0.83 | 28.1 |
| 92.49721085905541 | 11.4 | 24.17 | 0.67 | 26.93 |
| 92.66455931573077 | 11.24 | 22.92 | 0.52 | 25.75 |
| 92.83190777240611 | 11.08 | 21.66 | 0.36 | 24.58 |
| 92.99925622908145 | 10.92 | 20.43 | 0.21 | 23.43 |
| 93.1666046857568 | 10.76 | 19.24 | 0.06 | 22.33 |
| 93.33395314243214 | 10.59 | 18.11 | -0.08 | 21.28 |
| 93.50130159910749 | 10.41 | 17.05 | -0.21 | 20.29 |
| 93.66865005578283 | 10.21 | 16.05 | -0.34 | 19.34 |
| 93.83599851245818 | 10.01 | 15.12 | -0.46 | 18.45 |
| 94.00334696913353 | 9.79 | 14.25 | -0.57 | 17.61 |
| 94.17069542580886 | 9.57 | 13.47 | -0.68 | 16.84 |
| 94.3380438824842 | 9.33 | 12.76 | -0.78 | 16.12 |
| 94.50539233915954 | 9.08 | 12.14 | -0.87 | 15.48 |
| 94.66344365935292 | 8.82 | 11.61 | -0.95 | 14.89 |
| 94.83079211602828 | 8.55 | 11.16 | -1.02 | 14.37 |
| 94.99814057270362 | 8.28 | 10.77 | -1.09 | 13.91 |
| 95.16548902937897 | 8.01 | 10.46 | -1.16 | 13.51 |
| 95.33283748605432 | 7.74 | 10.22 | -1.23 | 13.17 |
| 95.50018594272963 | 7.48 | 10.04 | -1.29 | 12.88 |
| 95.66753439940499 | 7.25 | 9.93 | -1.34 | 12.66 |
| 95.83488285608034 | 7.03 | 9.88 | -1.39 | 12.51 |
| 96.00223131275567 | 6.84 | 9.87 | -1.44 | 12.41 |
| 96.16957976943102 | 6.7 | 9.91 | -1.48 | 12.37 |
| 96.33692822610638 | 6.59 | 9.97 | -1.51 | 12.37 |
| 96.50427668278171 | 6.53 | 10.06 | -1.53 | 12.43 |
| 96.67162513945706 | 6.5 | 10.18 | -1.54 | 12.53 |
| 96.8389735961324 | 6.49 | 10.37 | -1.54 | 12.69 |
| 96.99702491632577 | 6.45 | 10.63 | -1.54 | 12.9 |
| 97.16437337300111 | 6.41 | 10.95 | -1.53 | 13.17 |
| 97.33172182967647 | 6.37 | 11.33 | -1.51 | 13.48 |
| 97.49907028635181 | 6.32 | 11.78 | -1.48 | 13.84 |
| 97.66641874302715 | 6.29 | 12.27 | -1.45 | 14.26 |
| 97.8337671997025 | 6.26 | 12.82 | -1.39 | 14.72 |
| 98.00111565637785 | 6.23 | 13.41 | -1.33 | 15.24 |
| 98.16846411305319 | 6.22 | 14.05 | -1.26 | 15.8 |
| 98.33581256972855 | 6.21 | 14.75 | -1.17 | 16.42 |
| 98.50316102640389 | 6.23 | 15.49 | -1.07 | 17.1 |
| 98.67050948307921 | 6.26 | 16.26 | -0.96 | 17.81 |
| 98.83785793975456 | 6.3 | 17.05 | -0.85 | 18.55 |
| 99.0052063964299 | 6.36 | 17.8 | -0.73 | 19.27 |
| 99.17255485310525 | 6.4 | 18.48 | -0.62 | 19.91 |
| 99.33060617329863 | 6.42 | 19.05 | -0.52 | 20.45 |
| 99.49795462997399 | 6.44 | 19.53 | -0.44 | 20.9 |
| 99.66530308664933 | 6.46 | 19.9 | -0.37 | 21.25 |
| 99.83265154332467 | 6.47 | 20.16 | -0.33 | 21.5 |
| 100.0 | 6.49 | 20.3 | -0.3 | 21.64 |